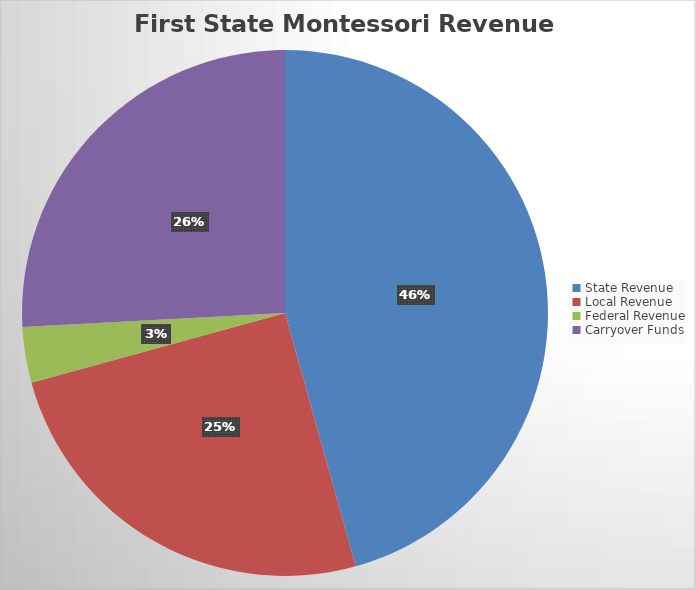
| Category | Series 0 |
|---|---|
| State Revenue | 5245408.5 |
| Local Revenue | 2877580.11 |
| Federal Revenue | 393583 |
| Carryover Funds | 2969055.99 |